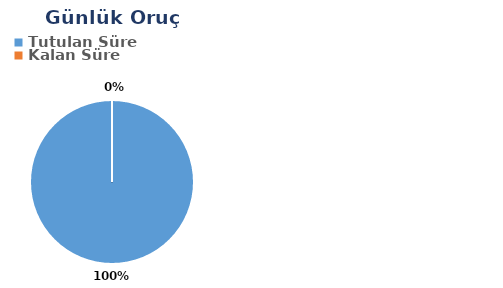
| Category | Günlük |
|---|---|
| Tutulan Süre | 0.587 |
| Kalan Süre | 0 |